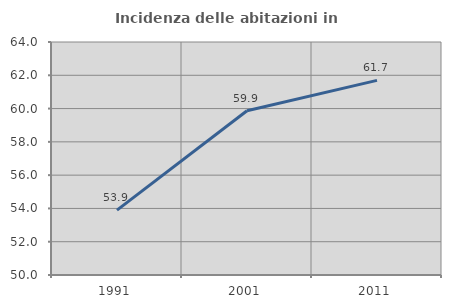
| Category | Incidenza delle abitazioni in proprietà  |
|---|---|
| 1991.0 | 53.9 |
| 2001.0 | 59.868 |
| 2011.0 | 61.696 |